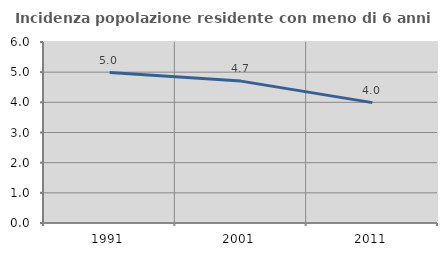
| Category | Incidenza popolazione residente con meno di 6 anni |
|---|---|
| 1991.0 | 4.989 |
| 2001.0 | 4.703 |
| 2011.0 | 3.991 |